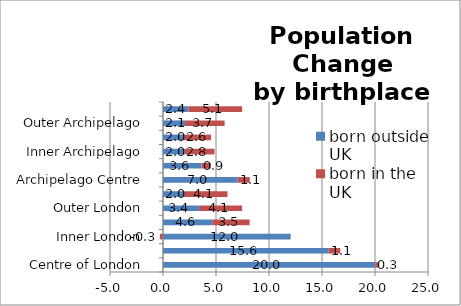
| Category | born outside UK | born in the UK |
|---|---|---|
| Centre of London | 20.032 | 0.295 |
| London Core | 15.627 | 1.099 |
| Inner London | 12.04 | -0.299 |
| London Suburbs | 4.643 | 3.525 |
| Outer London | 3.414 | 4.052 |
| London Edge | 1.966 | 4.121 |
| Archipelago Centre | 7.042 | 1.145 |
| Archipelago Core | 3.631 | 0.883 |
| Inner Archipelago | 2.014 | 2.846 |
| Archipelago Suburbs | 1.955 | 2.571 |
| Outer Archipelago | 2.08 | 3.733 |
| Archipelago Edge | 2.401 | 5.065 |